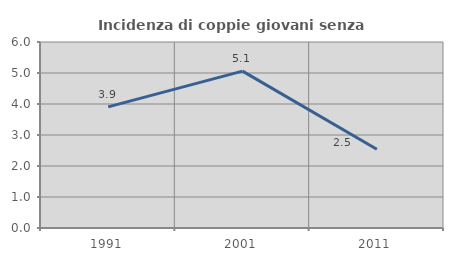
| Category | Incidenza di coppie giovani senza figli |
|---|---|
| 1991.0 | 3.908 |
| 2001.0 | 5.06 |
| 2011.0 | 2.539 |